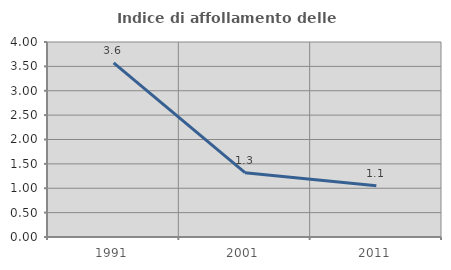
| Category | Indice di affollamento delle abitazioni  |
|---|---|
| 1991.0 | 3.571 |
| 2001.0 | 1.32 |
| 2011.0 | 1.053 |